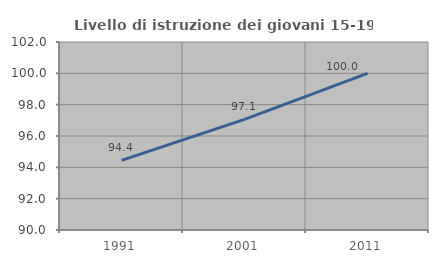
| Category | Livello di istruzione dei giovani 15-19 anni |
|---|---|
| 1991.0 | 94.444 |
| 2001.0 | 97.059 |
| 2011.0 | 100 |